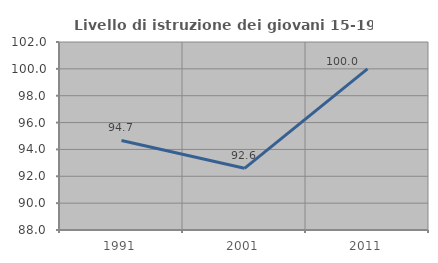
| Category | Livello di istruzione dei giovani 15-19 anni |
|---|---|
| 1991.0 | 94.667 |
| 2001.0 | 92.593 |
| 2011.0 | 100 |